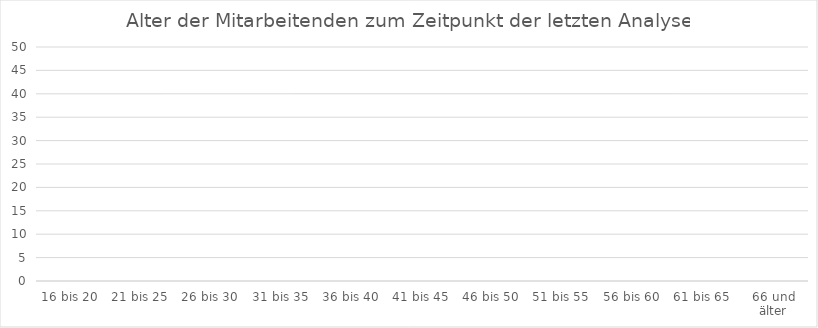
| Category | Anzahl |
|---|---|
| 16 bis 20 | 0 |
| 21 bis 25 | 0 |
| 26 bis 30 | 0 |
| 31 bis 35 | 0 |
| 36 bis 40 | 0 |
| 41 bis 45 | 0 |
| 46 bis 50 | 0 |
| 51 bis 55 | 0 |
| 56 bis 60 | 0 |
| 61 bis 65 | 0 |
| 66 und älter | 0 |